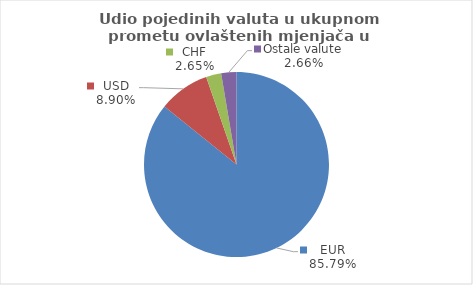
| Category | Series 0 |
|---|---|
| EUR | 85.788 |
| USD | 8.902 |
| CHF | 2.65 |
| Ostale valute | 2.661 |